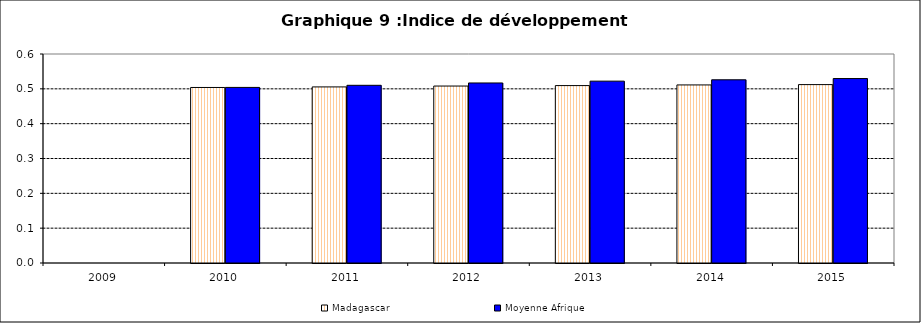
| Category | Madagascar | Moyenne Afrique |
|---|---|---|
| 2009.0 | 0 | 0 |
| 2010.0 | 0.504 | 0.504 |
| 2011.0 | 0.506 | 0.51 |
| 2012.0 | 0.508 | 0.517 |
| 2013.0 | 0.509 | 0.522 |
| 2014.0 | 0.511 | 0.526 |
| 2015.0 | 0.512 | 0.53 |